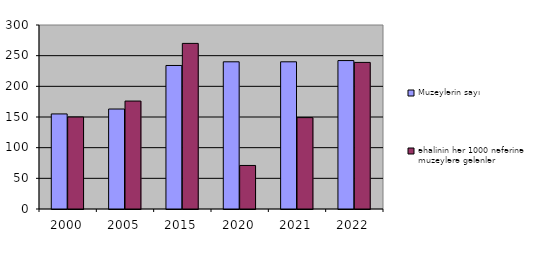
| Category | Muzeylərin sayı | əhalinin hər 1000 nəfərinə muzeylərə gələnlər |
|---|---|---|
| 2000.0 | 155 | 150 |
| 2005.0 | 163 | 176 |
| 2015.0 | 234 | 270 |
| 2020.0 | 240 | 71 |
| 2021.0 | 240 | 149 |
| 2022.0 | 242 | 239 |